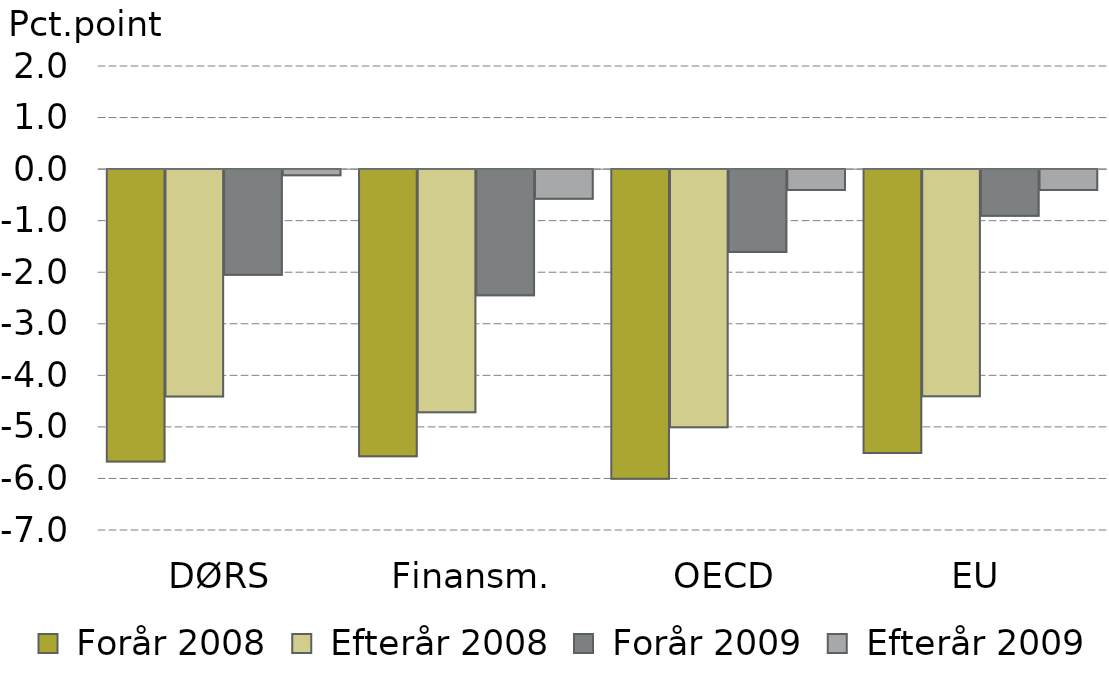
| Category |  Forår 2008 |  Efterår 2008 |  Forår 2009 |  Efterår 2009 |
|---|---|---|---|---|
| DØRS | -5.67 | -4.412 | -2.049 | -0.117 |
| Finansm. | -5.57 | -4.718 | -2.447 | -0.574 |
| OECD | -6.007 | -5.007 | -1.607 | -0.407 |
| EU | -5.507 | -4.407 | -0.907 | -0.407 |